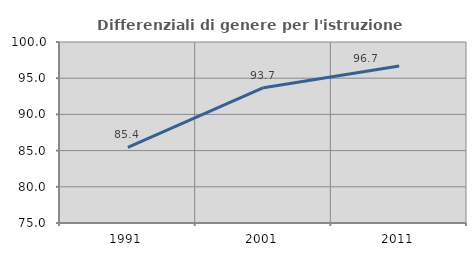
| Category | Differenziali di genere per l'istruzione superiore |
|---|---|
| 1991.0 | 85.438 |
| 2001.0 | 93.685 |
| 2011.0 | 96.693 |